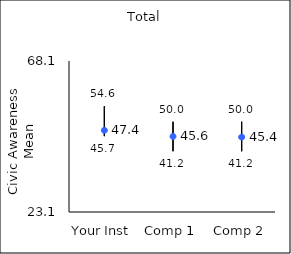
| Category | 25th percentile | 75th percentile | Mean |
|---|---|---|---|
| Your Inst | 45.7 | 54.6 | 47.44 |
| Comp 1 | 41.2 | 50 | 45.61 |
| Comp 2 | 41.2 | 50 | 45.42 |